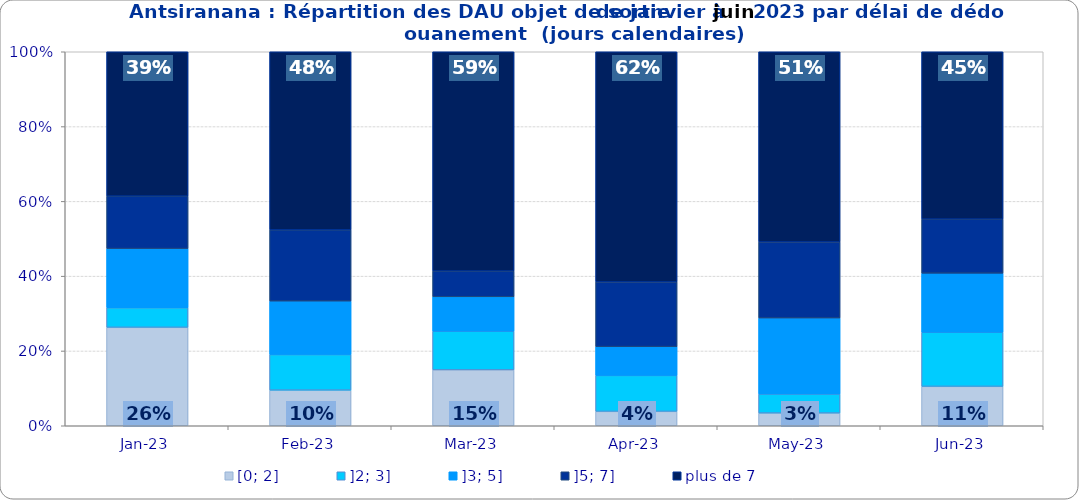
| Category | [0; 2] | ]2; 3] | ]3; 5] | ]5; 7] | plus de 7 |
|---|---|---|---|---|---|
| 2023-01-01 | 0.263 | 0.053 | 0.158 | 0.14 | 0.386 |
| 2023-02-01 | 0.095 | 0.095 | 0.143 | 0.19 | 0.476 |
| 2023-03-01 | 0.149 | 0.103 | 0.092 | 0.069 | 0.586 |
| 2023-04-01 | 0.038 | 0.096 | 0.077 | 0.173 | 0.615 |
| 2023-05-01 | 0.034 | 0.051 | 0.203 | 0.203 | 0.508 |
| 2023-06-01 | 0.105 | 0.145 | 0.158 | 0.145 | 0.447 |